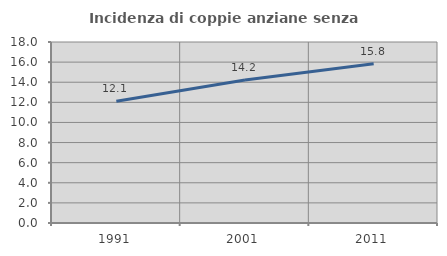
| Category | Incidenza di coppie anziane senza figli  |
|---|---|
| 1991.0 | 12.117 |
| 2001.0 | 14.221 |
| 2011.0 | 15.831 |